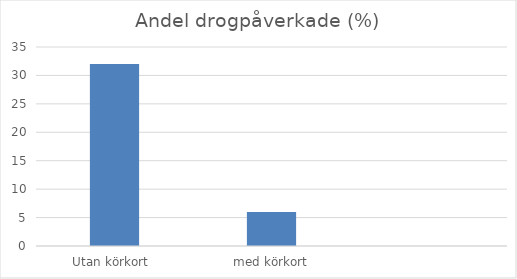
| Category | Andel % |
|---|---|
| Utan körkort  | 32 |
| med körkort | 6 |